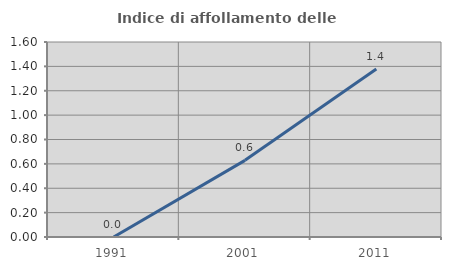
| Category | Indice di affollamento delle abitazioni  |
|---|---|
| 1991.0 | 0 |
| 2001.0 | 0.629 |
| 2011.0 | 1.379 |